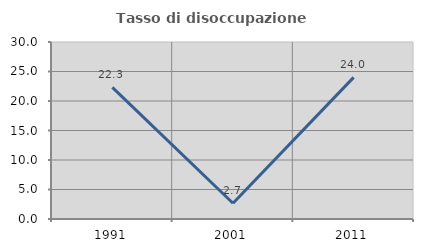
| Category | Tasso di disoccupazione giovanile  |
|---|---|
| 1991.0 | 22.321 |
| 2001.0 | 2.667 |
| 2011.0 | 24 |